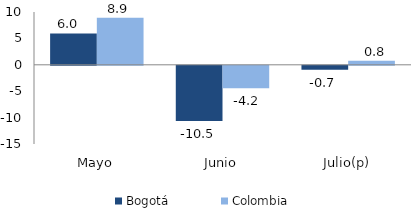
| Category | Bogotá | Colombia |
|---|---|---|
| Mayo | 5.951 | 8.927 |
| Junio | -10.451 | -4.248 |
| Julio(p) | -0.727 | 0.768 |